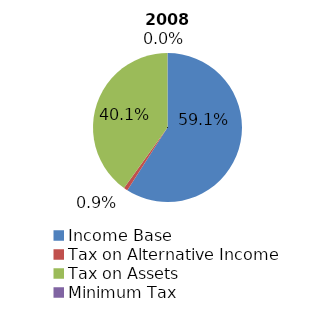
| Category | 2008 |
|---|---|
| Income Base | 428328457 |
| Tax on Alternative Income  | 6256500 |
| Tax on Assets | 290535914 |
| Minimum Tax | 75500 |